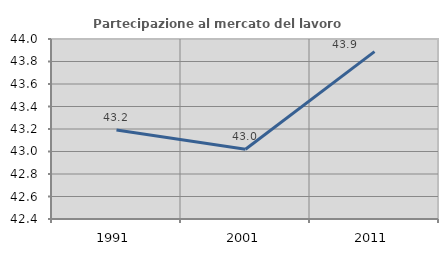
| Category | Partecipazione al mercato del lavoro  femminile |
|---|---|
| 1991.0 | 43.191 |
| 2001.0 | 43.021 |
| 2011.0 | 43.888 |